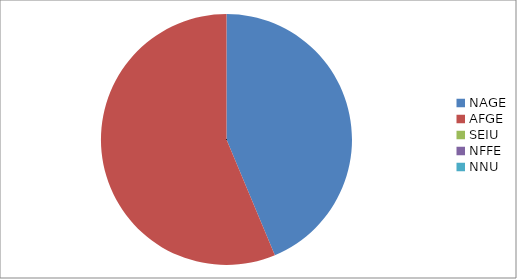
| Category | Series 0 |
|---|---|
| NAGE | 4253 |
| AFGE | 5479 |
| SEIU | 0 |
| NFFE | 0 |
| NNU | 0 |